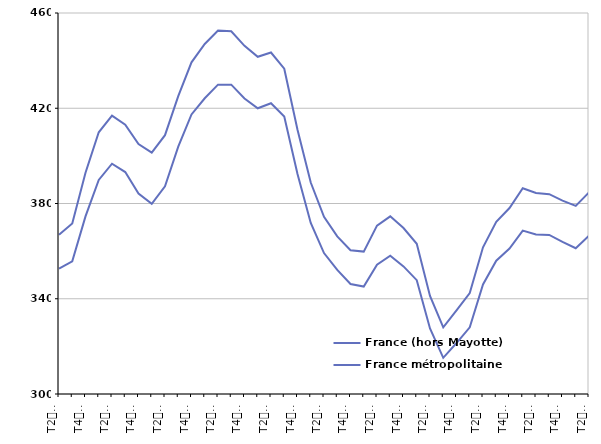
| Category | France (hors Mayotte) | France métropolitaine |
|---|---|---|
| T2
2013 | 366.9 | 352.6 |
| T3
2013 | 371.6 | 355.7 |
| T4
2013 | 392.9 | 374.6 |
| T1
2014 | 409.9 | 389.9 |
| T2
2014 | 416.9 | 396.7 |
| T3
2014 | 413.1 | 393.2 |
| T4
2014 | 405 | 384.2 |
| T1
2015 | 401.4 | 379.9 |
| T2
2015 | 408.7 | 387.2 |
| T3
2015 | 425.1 | 403.9 |
| T4
2015 | 439.3 | 417.4 |
| T1
2016 | 447 | 424.2 |
| T2
2016 | 452.6 | 429.9 |
| T3
2016 | 452.3 | 429.9 |
| T4
2016 | 446.2 | 424.1 |
| T1
2017 | 441.6 | 420 |
| T2
2017 | 443.4 | 422.1 |
| T3
2017 | 436.6 | 416.5 |
| T4
2017 | 411 | 392.4 |
| T1
2018 | 388.8 | 371.8 |
| T2
2018 | 374.4 | 359.2 |
| T3
2018 | 366.2 | 352.1 |
| T4
2018 | 360.4 | 346.2 |
| T1
2019 | 359.8 | 345.1 |
| T2
2019 | 370.7 | 354.3 |
| T3
2019 | 374.6 | 358.1 |
| T4
2019 | 369.7 | 353.6 |
| T1
2020 | 363.1 | 347.8 |
| T2
2020 | 341.2 | 327.5 |
| T3
2020 | 328 | 315.2 |
| T4
2020 | 335.1 | 321.4 |
| T1
2021 | 342.4 | 328 |
| T2
2021 | 361.6 | 346 |
| T3
2021 | 372.3 | 356 |
| T4
2021 | 378.1 | 361.1 |
| T1
2022 | 386.4 | 368.6 |
| T2
2022 | 384.4 | 367 |
| T3
2022 | 383.9 | 366.8 |
| T4
2022 | 381.2 | 363.9 |
| T1
2023 | 379 | 361.2 |
| T2
2023 | 384.7 | 366.5 |